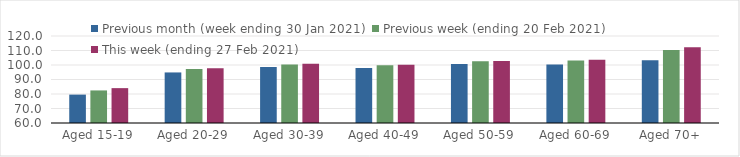
| Category | Previous month (week ending 30 Jan 2021) | Previous week (ending 20 Feb 2021) | This week (ending 27 Feb 2021) |
|---|---|---|---|
| Aged 15-19 | 79.58 | 82.46 | 84.05 |
| Aged 20-29 | 94.87 | 97.25 | 97.78 |
| Aged 30-39 | 98.55 | 100.38 | 100.84 |
| Aged 40-49 | 97.86 | 99.8 | 100.22 |
| Aged 50-59 | 100.7 | 102.58 | 102.68 |
| Aged 60-69 | 100.3 | 103.18 | 103.54 |
| Aged 70+ | 103.21 | 110.38 | 112.22 |